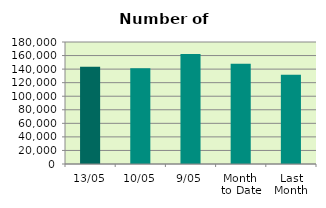
| Category | Series 0 |
|---|---|
| 13/05 | 143464 |
| 10/05 | 141328 |
| 9/05 | 162318 |
| Month 
to Date | 147754.25 |
| Last
Month | 131708.5 |